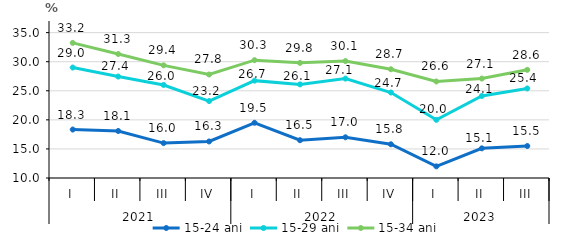
| Category | 15-24 ani | 15-29 ani | 15-34 ani |
|---|---|---|---|
| 0 | 18.335 | 28.999 | 33.235 |
| 1 | 18.083 | 27.448 | 31.318 |
| 2 | 16 | 26 | 29.373 |
| 3 | 16.283 | 23.232 | 27.8 |
| 4 | 19.497 | 26.744 | 30.262 |
| 5 | 16.5 | 26.1 | 29.8 |
| 6 | 17 | 27.1 | 30.1 |
| 7 | 15.8 | 24.7 | 28.7 |
| 8 | 12 | 20 | 26.6 |
| 9 | 15.1 | 24.1 | 27.1 |
| 10 | 15.5 | 25.4 | 28.6 |